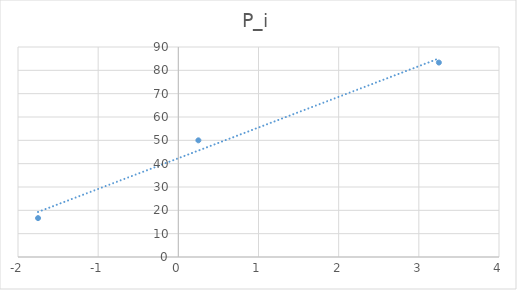
| Category | P_i |
|---|---|
| -1.75 | 16.667 |
| 0.25 | 50 |
| 3.25 | 83.333 |